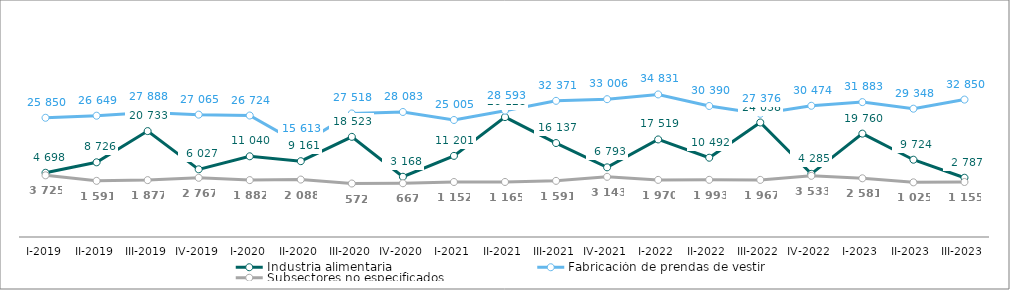
| Category | Industria alimentaria | Fabricación de prendas de vestir | Subsectores no especificados |
|---|---|---|---|
| I-2019 | 4698 | 25850 | 3725 |
| II-2019 | 8726 | 26649 | 1591 |
| III-2019 | 20733 | 27888 | 1877 |
| IV-2019 | 6027 | 27065 | 2767 |
| I-2020 | 11040 | 26724 | 1882 |
| II-2020 | 9161 | 15613 | 2088 |
| III-2020 | 18523 | 27518 | 572 |
| IV-2020 | 3168 | 28083 | 667 |
| I-2021 | 11201 | 25005 | 1152 |
| II-2021 | 26128 | 28593 | 1165 |
| III-2021 | 16137 | 32371 | 1591 |
| IV-2021 | 6793 | 33006 | 3143 |
| I-2022 | 17519 | 34831 | 1970 |
| II-2022 | 10492 | 30390 | 1993 |
| III-2022 | 24038 | 27376 | 1967 |
| IV-2022 | 4285 | 30474 | 3533 |
| I-2023 | 19760 | 31883 | 2581 |
| II-2023 | 9724 | 29348 | 1025 |
| III-2023 | 2787 | 32850 | 1155 |